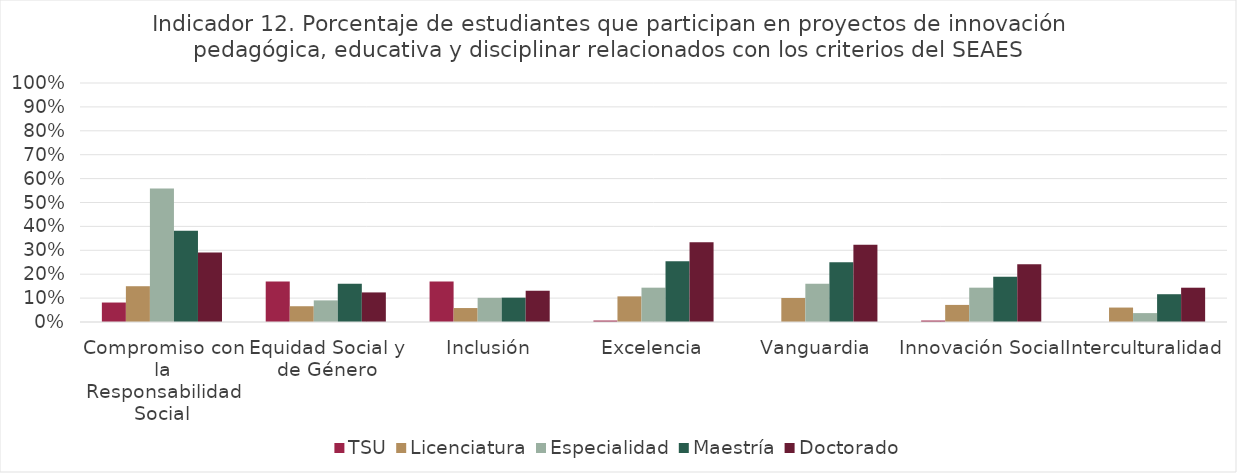
| Category | TSU | Licenciatura | Especialidad | Maestría | Doctorado |
|---|---|---|---|---|---|
| Compromiso con la Responsabilidad Social | 0.081 | 0.15 | 0.559 | 0.382 | 0.291 |
| Equidad Social y de Género | 0.169 | 0.066 | 0.09 | 0.16 | 0.124 |
| Inclusión | 0.169 | 0.058 | 0.101 | 0.102 | 0.131 |
| Excelencia | 0.006 | 0.107 | 0.144 | 0.254 | 0.333 |
| Vanguardia | 0 | 0.1 | 0.16 | 0.25 | 0.323 |
| Innovación Social | 0.006 | 0.072 | 0.144 | 0.189 | 0.242 |
| Interculturalidad | 0 | 0.06 | 0.037 | 0.116 | 0.143 |